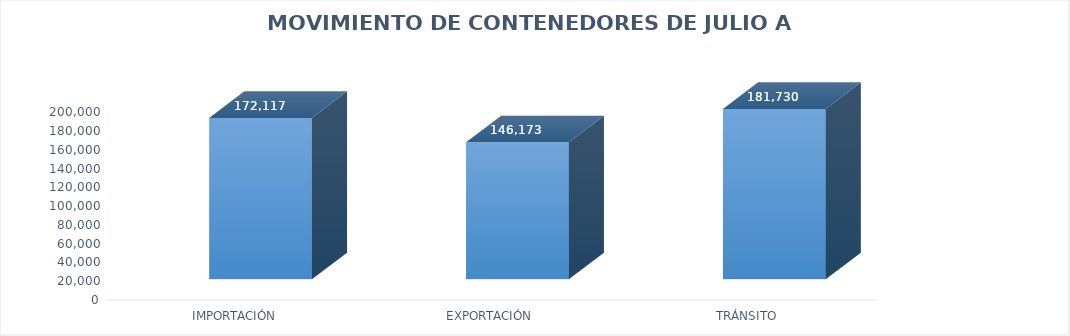
| Category | Series 0 |
|---|---|
|  IMPORTACIÓN | 172117 |
| EXPORTACIÓN | 146173 |
| TRÁNSITO | 181730 |